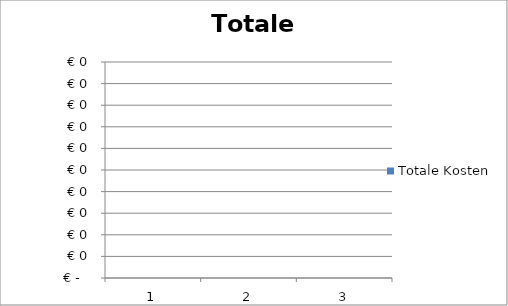
| Category | Totale Kosten |
|---|---|
| 0 | 0 |
| 1 | 0 |
| 2 | 0 |